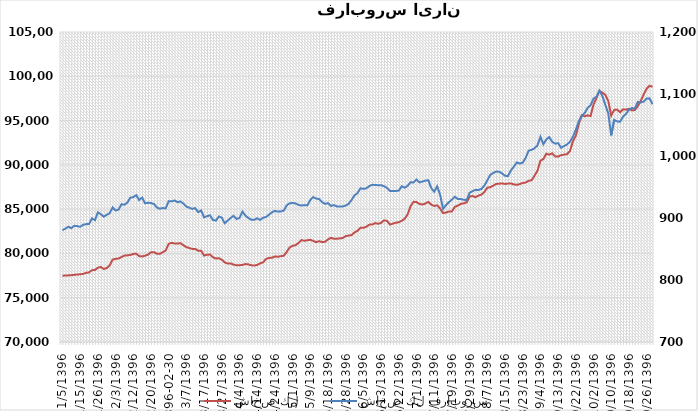
| Category | شاخص كل |
|---|---|
| 1396-01-05 | 77485.8 |
| 1396-01-06 | 77502.9 |
| 1396-01-07 | 77523.3 |
| 1396-01-08 | 77548.5 |
| 1396-01-09 | 77584.4 |
| 1396-01-14 | 77616.8 |
| 1396-01-15 | 77647.1 |
| 1396-01-16 | 77689.9 |
| 1396-01-19 | 77804.7 |
| 1396-01-20 | 77860.4 |
| 1396-01-21 | 78107.8 |
| 1396-01-23 | 78132.4 |
| 1396-01-26 | 78383.3 |
| 1396-01-27 | 78471.7 |
| 1396-01-28 | 78247.5 |
| 1396-01-29 | 78339.8 |
| 1396-01-30 | 78651.4 |
| 1396-02-02 | 79302.7 |
| 1396-02-03 | 79390.6 |
| 1396-02-04 | 79425.9 |
| 1396-02-06 | 79596.9 |
| 1396-02-09 | 79755.6 |
| 1396-02-10 | 79785 |
| 1396-02-11 | 79826.6 |
| 1396-02-12 | 79942.1 |
| 1396-02-13 | 79969.2 |
| 1396-02-16 | 79697.4 |
| 1396-02-17 | 79660.9 |
| 1396-02-18 | 79744.1 |
| 1396-02-19 | 79858.8 |
| 1396-02-20 | 80127.1 |
| 1396-02-23 | 80142 |
| 1396-02-24 | 79963 |
| 1396-02-25 | 79957.5 |
| 1396-02-26 | 80129.3 |
| 1396-02-27 | 80344.2 |
| 1396-02-30 | 81077.6 |
| 1396-02-31 | 81194 |
| 1396-03-01 | 81124.4 |
| 1396-03-02 | 81124.4 |
| 1396-03-03 | 81146.2 |
| 1396-03-06 | 80921.2 |
| 1396-03-07 | 80713.2 |
| 1396-03-08 | 80607.9 |
| 1396-03-09 | 80511.5 |
| 1396-03-10 | 80513.3 |
| 1396-03-13 | 80288.9 |
| 1396-03-16 | 80293.5 |
| 1396-03-17 | 79758.5 |
| 1396-03-20 | 79855.7 |
| 1396-03-21 | 79870.7 |
| 1396-03-22 | 79564.1 |
| 1396-03-23 | 79426.9 |
| 1396-03-24 | 79465.7 |
| 1396-03-27 | 79285 |
| 1396-03-28 | 78990.4 |
| 1396-03-29 | 78859.2 |
| 1396-03-30 | 78867.5 |
| 1396-03-31 | 78736.2 |
| 1396-04-03 | 78652.7 |
| 1396-04-04 | 78665.5 |
| 1396-04-07 | 78704.5 |
| 1396-04-10 | 78799.7 |
| 1396-04-11 | 78765.3 |
| 1396-04-12 | 78659.2 |
| 1396-04-13 | 78632.5 |
| 1396-04-14 | 78700.2 |
| 1396-04-17 | 78881.6 |
| 1396-04-18 | 78985.4 |
| 1396-04-19 | 79377 |
| 1396-04-20 | 79490.4 |
| 1396-04-21 | 79509.6 |
| 1396-04-24 | 79658.9 |
| 1396-04-25 | 79620.8 |
| 1396-04-26 | 79692.9 |
| 1396-04-27 | 79735.7 |
| 1396-04-28 | 80162.5 |
| 1396-04-31 | 80670.8 |
| 1396-05-01 | 80863 |
| 1396-05-02 | 80933.9 |
| 1396-05-03 | 81181.7 |
| 1396-05-04 | 81509.3 |
| 1396-05-07 | 81420.9 |
| 1396-05-08 | 81491.4 |
| 1396-05-09 | 81533.5 |
| 1396-05-10 | 81415.9 |
| 1396-05-11 | 81265.9 |
| 1396-05-15 | 81384.1 |
| 1396-05-16 | 81285.7 |
| 1396-05-17 | 81313.9 |
| 1396-05-18 | 81579.3 |
| 1396-05-21 | 81763.1 |
| 1396-05-22 | 81661.5 |
| 1396-05-23 | 81659.3 |
| 1396-05-24 | 81696.3 |
| 1396-05-25 | 81741.9 |
| 1396-05-28 | 81954.9 |
| 1396-05-29 | 82016.2 |
| 1396-05-30 | 82075 |
| 1396-05-31 | 82372.4 |
| 1396-06-01 | 82541.8 |
| 1396-06-04 | 82897.1 |
| 1396-06-05 | 82885 |
| 1396-06-06 | 83012.1 |
| 1396-06-07 | 83252 |
| 1396-06-08 | 83272.9 |
| 1396-06-11 | 83428.2 |
| 1396-06-12 | 83345.2 |
| 1396-06-13 | 83452.1 |
| 1396-06-14 | 83733.5 |
| 1396-06-15 | 83675.3 |
| 1396-06-19 | 83255.7 |
| 1396-06-20 | 83369.1 |
| 1396-06-21 | 83469.2 |
| 1396-06-22 | 83523.8 |
| 1396-06-25 | 83683.2 |
| 1396-06-26 | 83916.6 |
| 1396-06-27 | 84414.5 |
| 1396-06-28 | 85343.9 |
| 1396-06-29 | 85831.8 |
| 1396-07-01 | 85798.4 |
| 1396-07-02 | 85588.8 |
| 1396-07-03 | 85516.9 |
| 1396-07-04 | 85628.8 |
| 1396-07-05 | 85819 |
| 1396-07-10 | 85514.9 |
| 1396-07-11 | 85355 |
| 1396-07-12 | 85429.5 |
| 1396-07-15 | 85069.5 |
| 1396-07-16 | 84564.9 |
| 1396-07-17 | 84611.6 |
| 1396-07-18 | 84734.4 |
| 1396-07-19 | 84744.1 |
| 1396-07-22 | 85263.6 |
| 1396-07-23 | 85394.9 |
| 1396-07-24 | 85590.7 |
| 1396-07-25 | 85660 |
| 1396-07-26 | 85768 |
| 1396-07-29 | 86430.5 |
| 1396-07-30 | 86480.2 |
| 1396-08-01 | 86346.2 |
| 1396-08-02 | 86529.2 |
| 1396-08-03 | 86636.8 |
| 1396-08-06 | 86935.4 |
| 1396-08-07 | 87416.6 |
| 1396-08-08 | 87477.2 |
| 1396-08-09 | 87649.9 |
| 1396-08-10 | 87844.9 |
| 1396-08-13 | 87868.6 |
| 1396-08-14 | 87905.1 |
| 1396-08-15 | 87843.7 |
| 1396-08-16 | 87883.1 |
| 1396-08-17 | 87897.4 |
| 1396-08-20 | 87795.2 |
| 1396-08-21 | 87744.7 |
| 1396-08-22 | 87832.5 |
| 1396-08-23 | 87949.8 |
| 1396-08-24 | 88005.9 |
| 1396-08-27 | 88202.3 |
| 1396-08-29 | 88261.2 |
| 1396-08-30 | 88774.6 |
| 1396-09-01 | 89339.1 |
| 1396-09-04 | 90469.5 |
| 1396-09-05 | 90655.5 |
| 1396-09-07 | 91255.2 |
| 1396-09-08 | 91152.2 |
| 1396-09-11 | 91296.7 |
| 1396-09-12 | 90951.8 |
| 1396-09-13 | 90936.6 |
| 1396-09-14 | 91092.2 |
| 1396-09-18 | 91160.3 |
| 1396-09-19 | 91198.9 |
| 1396-09-20 | 91552.4 |
| 1396-09-21 | 92628.9 |
| 1396-09-22 | 93283.7 |
| 1396-09-25 | 94606.424 |
| 1396-09-26 | 95600.749 |
| 1396-09-27 | 95477.406 |
| 1396-09-28 | 95590.611 |
| 1396-09-29 | 95508.639 |
| 1396-10-02 | 96816.034 |
| 1396-10-03 | 97529.346 |
| 1396-10-04 | 98358.421 |
| 1396-10-05 | 98152.798 |
| 1396-10-06 | 97899.156 |
| 1396-10-09 | 97211.41 |
| 1396-10-10 | 95561.578 |
| 1396-10-11 | 96207.996 |
| 1396-10-12 | 96241.28 |
| 1396-10-13 | 95929.456 |
| 1396-10-16 | 96270.387 |
| 1396-10-17 | 96234.539 |
| 1396-10-18 | 96332.547 |
| 1396-10-19 | 96149.269 |
| 1396-10-20 | 96185.986 |
| 1396-10-23 | 96627.552 |
| 1396-10-24 | 97228.674 |
| 1396-10-25 | 97944.035 |
| 1396-10-26 | 98596.934 |
| 1396-10-27 | 98923.554 |
| 1396-10-30 | 98817.281 |